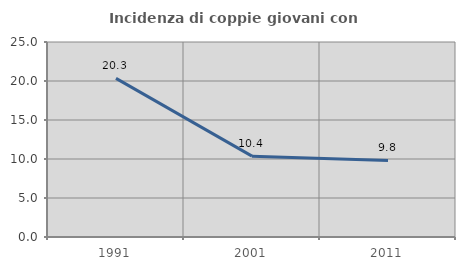
| Category | Incidenza di coppie giovani con figli |
|---|---|
| 1991.0 | 20.334 |
| 2001.0 | 10.363 |
| 2011.0 | 9.817 |